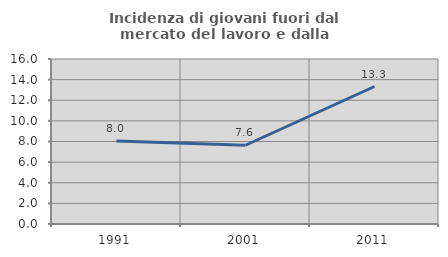
| Category | Incidenza di giovani fuori dal mercato del lavoro e dalla formazione  |
|---|---|
| 1991.0 | 8.039 |
| 2001.0 | 7.636 |
| 2011.0 | 13.333 |